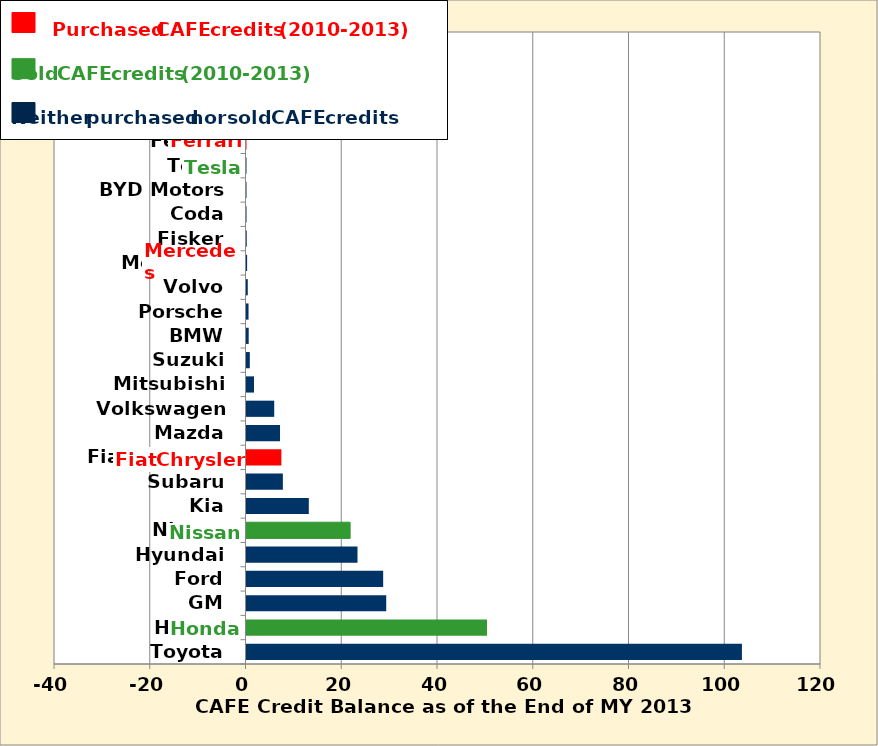
| Category | Series 0 |
|---|---|
| Toyota | 103484295 |
| Honda | 50234560 |
| GM | 29185540 |
| Ford | 28546438 |
| Hyundai | 23186604 |
| Nissan | 21641784 |
| Kia | 13016497 |
| Subaru | 7597337 |
| Fiat Chrysler | 7279810 |
| Mazda | 7003960 |
| Volkswagen | 5789961 |
| Mitsubishi | 1565382 |
| Suzuki | 693553 |
| BMW | 456812 |
| Porsche | 426439 |
| Volvo | 268157 |
| Mercedes | 129312 |
| Fisker | 46694 |
| Coda | 7251 |
| BYD Motors | 2276 |
| Tesla | 1271 |
| Ferrari | -653 |
| Lotus | -763 |
| McLaren | -3620 |
| Aston Martin | -4783 |
| Jaguar Land Rover | -927143 |